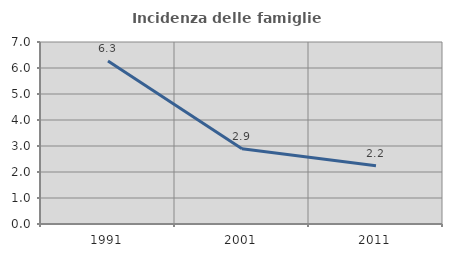
| Category | Incidenza delle famiglie numerose |
|---|---|
| 1991.0 | 6.274 |
| 2001.0 | 2.894 |
| 2011.0 | 2.241 |